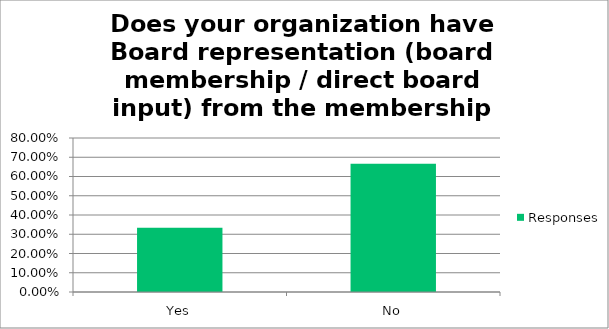
| Category | Responses |
|---|---|
| Yes | 0.333 |
| No | 0.667 |